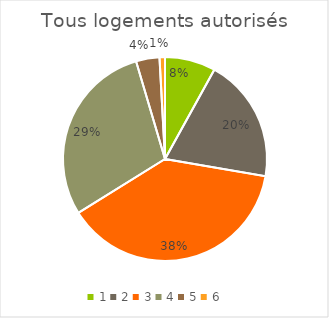
| Category | Series 0 |
|---|---|
| 0 | 0.08 |
| 1 | 0.197 |
| 2 | 0.385 |
| 3 | 0.293 |
| 4 | 0.037 |
| 5 | 0.009 |